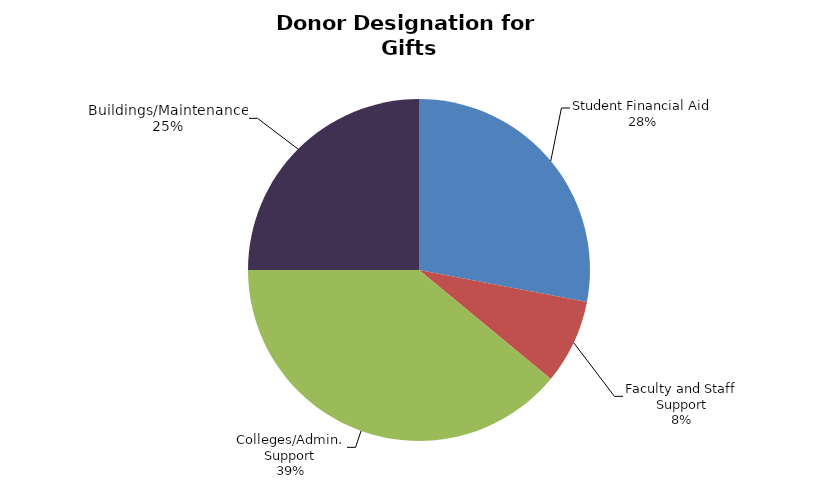
| Category | Series 0 |
|---|---|
| Student Financial Aid | 0.28 |
| Faculty and Staff Support | 0.08 |
| Colleges/Admin. Support | 0.39 |
| Buildings/Maintenance | 0.25 |